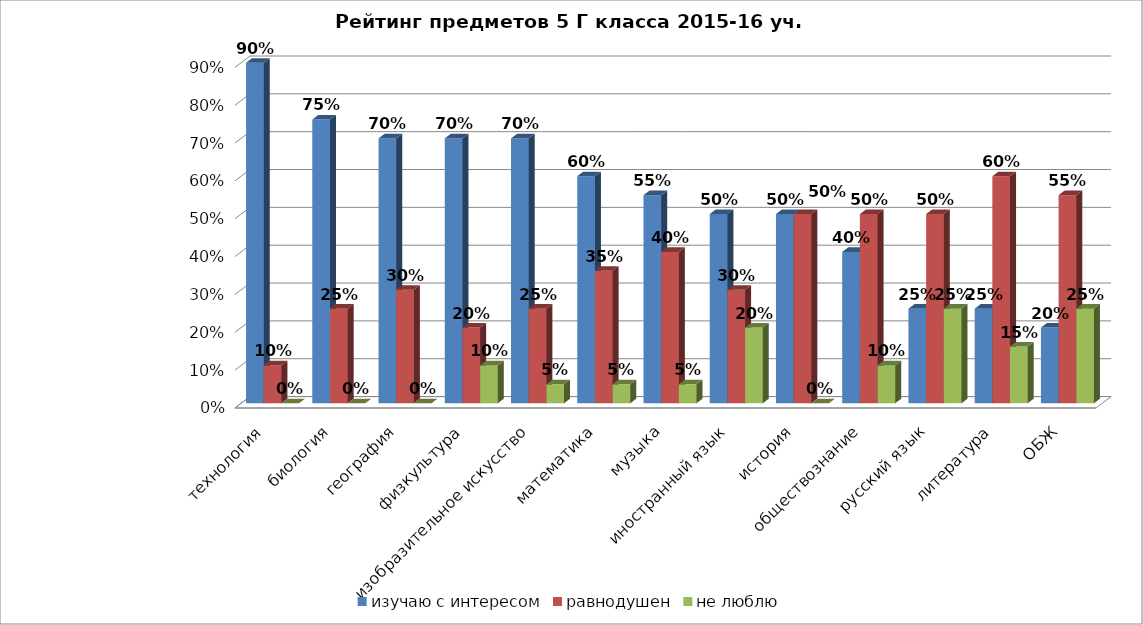
| Category | изучаю с интересом | равнодушен | не люблю |
|---|---|---|---|
| технология | 0.9 | 0.1 | 0 |
| биология | 0.75 | 0.25 | 0 |
| география | 0.7 | 0.3 | 0 |
| физкультура | 0.7 | 0.2 | 0.1 |
| изобразительное искусство | 0.7 | 0.25 | 0.05 |
| математика | 0.6 | 0.35 | 0.05 |
| музыка | 0.55 | 0.4 | 0.05 |
| иностранный язык | 0.5 | 0.3 | 0.2 |
| история | 0.5 | 0.5 | 0 |
| обществознание | 0.4 | 0.5 | 0.1 |
| русский язык | 0.25 | 0.5 | 0.25 |
| литература | 0.25 | 0.6 | 0.15 |
| ОБЖ | 0.2 | 0.55 | 0.25 |